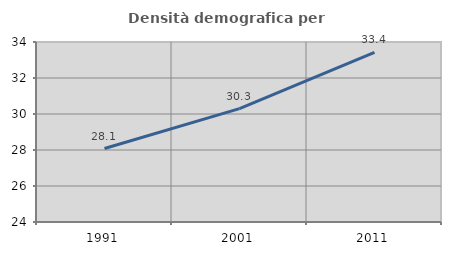
| Category | Densità demografica |
|---|---|
| 1991.0 | 28.08 |
| 2001.0 | 30.298 |
| 2011.0 | 33.427 |